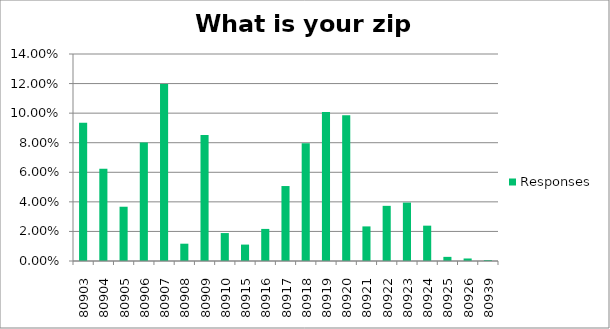
| Category | Responses |
|---|---|
| 80903 | 0.094 |
| 80904 | 0.062 |
| 80905 | 0.037 |
| 80906 | 0.08 |
| 80907 | 0.12 |
| 80908 | 0.012 |
| 80909 | 0.085 |
| 80910 | 0.019 |
| 80915 | 0.011 |
| 80916 | 0.022 |
| 80917 | 0.051 |
| 80918 | 0.08 |
| 80919 | 0.101 |
| 80920 | 0.099 |
| 80921 | 0.023 |
| 80922 | 0.037 |
| 80923 | 0.04 |
| 80924 | 0.024 |
| 80925 | 0.003 |
| 80926 | 0.002 |
| 80939 | 0.001 |